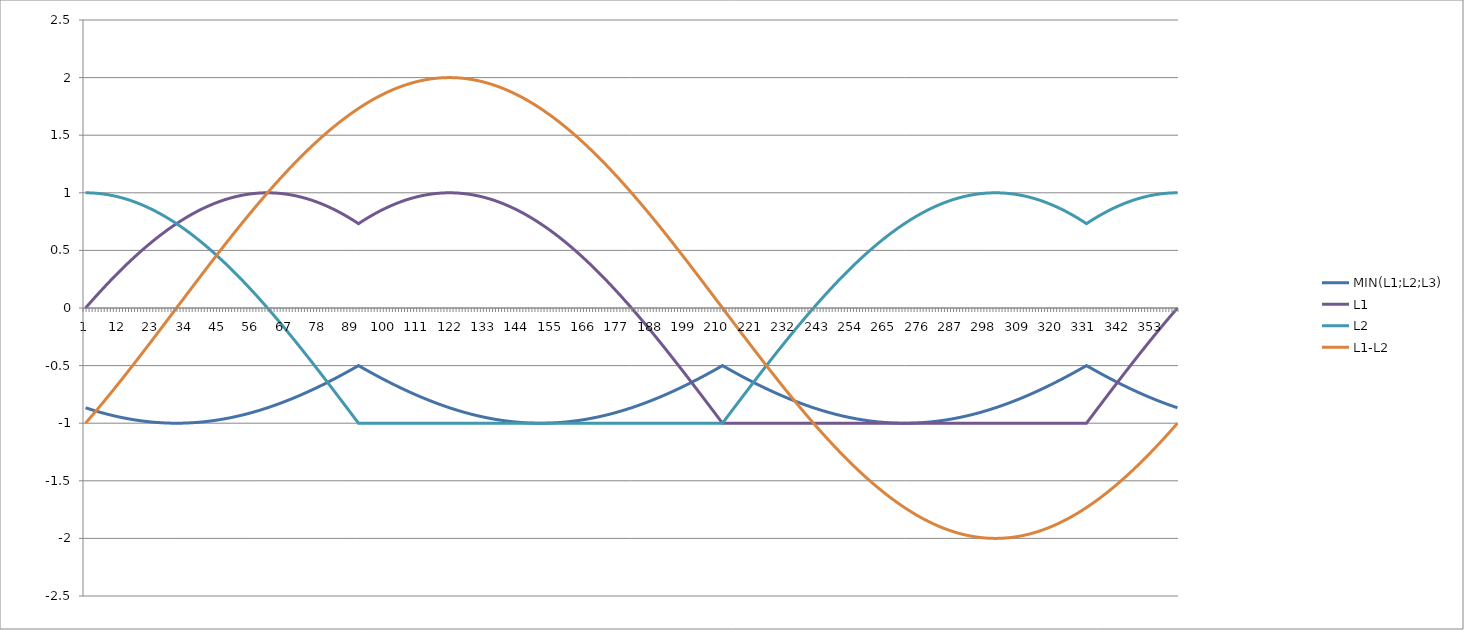
| Category | MIN(L1;L2;L3) | L1 | L2 | L1-L2 |
|---|---|---|---|---|
| 0 | -0.866 | 0 | 1 | -1 |
| 1 | -0.875 | 0.03 | 1 | -0.97 |
| 2 | -0.883 | 0.06 | 0.999 | -0.939 |
| 3 | -0.891 | 0.089 | 0.997 | -0.908 |
| 4 | -0.899 | 0.118 | 0.995 | -0.877 |
| 5 | -0.906 | 0.147 | 0.992 | -0.845 |
| 6 | -0.914 | 0.176 | 0.989 | -0.813 |
| 7 | -0.921 | 0.204 | 0.985 | -0.781 |
| 8 | -0.927 | 0.231 | 0.981 | -0.749 |
| 9 | -0.934 | 0.259 | 0.975 | -0.717 |
| 10 | -0.94 | 0.286 | 0.97 | -0.684 |
| 11 | -0.946 | 0.312 | 0.963 | -0.651 |
| 12 | -0.951 | 0.338 | 0.956 | -0.618 |
| 13 | -0.956 | 0.364 | 0.949 | -0.585 |
| 14 | -0.961 | 0.389 | 0.941 | -0.551 |
| 15 | -0.966 | 0.414 | 0.932 | -0.518 |
| 16 | -0.97 | 0.439 | 0.923 | -0.484 |
| 17 | -0.974 | 0.463 | 0.913 | -0.45 |
| 18 | -0.978 | 0.486 | 0.902 | -0.416 |
| 19 | -0.982 | 0.509 | 0.891 | -0.382 |
| 20 | -0.985 | 0.532 | 0.879 | -0.347 |
| 21 | -0.988 | 0.554 | 0.867 | -0.313 |
| 22 | -0.99 | 0.576 | 0.854 | -0.278 |
| 23 | -0.993 | 0.597 | 0.841 | -0.244 |
| 24 | -0.995 | 0.618 | 0.827 | -0.209 |
| 25 | -0.996 | 0.638 | 0.813 | -0.174 |
| 26 | -0.998 | 0.658 | 0.798 | -0.14 |
| 27 | -0.999 | 0.677 | 0.782 | -0.105 |
| 28 | -0.999 | 0.696 | 0.766 | -0.07 |
| 29 | -1 | 0.714 | 0.749 | -0.035 |
| 30 | -1 | 0.732 | 0.732 | 0 |
| 31 | -1 | 0.749 | 0.714 | 0.035 |
| 32 | -0.999 | 0.766 | 0.696 | 0.07 |
| 33 | -0.999 | 0.782 | 0.677 | 0.105 |
| 34 | -0.998 | 0.798 | 0.658 | 0.14 |
| 35 | -0.996 | 0.813 | 0.638 | 0.174 |
| 36 | -0.995 | 0.827 | 0.618 | 0.209 |
| 37 | -0.993 | 0.841 | 0.597 | 0.244 |
| 38 | -0.99 | 0.854 | 0.576 | 0.278 |
| 39 | -0.988 | 0.867 | 0.554 | 0.313 |
| 40 | -0.985 | 0.879 | 0.532 | 0.347 |
| 41 | -0.982 | 0.891 | 0.509 | 0.382 |
| 42 | -0.978 | 0.902 | 0.486 | 0.416 |
| 43 | -0.974 | 0.913 | 0.463 | 0.45 |
| 44 | -0.97 | 0.923 | 0.439 | 0.484 |
| 45 | -0.966 | 0.932 | 0.414 | 0.518 |
| 46 | -0.961 | 0.941 | 0.389 | 0.551 |
| 47 | -0.956 | 0.949 | 0.364 | 0.585 |
| 48 | -0.951 | 0.956 | 0.338 | 0.618 |
| 49 | -0.946 | 0.963 | 0.312 | 0.651 |
| 50 | -0.94 | 0.97 | 0.286 | 0.684 |
| 51 | -0.934 | 0.975 | 0.259 | 0.717 |
| 52 | -0.927 | 0.981 | 0.231 | 0.749 |
| 53 | -0.921 | 0.985 | 0.204 | 0.781 |
| 54 | -0.914 | 0.989 | 0.176 | 0.813 |
| 55 | -0.906 | 0.992 | 0.147 | 0.845 |
| 56 | -0.899 | 0.995 | 0.118 | 0.877 |
| 57 | -0.891 | 0.997 | 0.089 | 0.908 |
| 58 | -0.883 | 0.999 | 0.06 | 0.939 |
| 59 | -0.875 | 1 | 0.03 | 0.97 |
| 60 | -0.866 | 1 | 0 | 1 |
| 61 | -0.857 | 1 | -0.03 | 1.03 |
| 62 | -0.848 | 0.999 | -0.061 | 1.06 |
| 63 | -0.839 | 0.997 | -0.092 | 1.089 |
| 64 | -0.829 | 0.995 | -0.123 | 1.118 |
| 65 | -0.819 | 0.992 | -0.155 | 1.147 |
| 66 | -0.809 | 0.989 | -0.187 | 1.176 |
| 67 | -0.799 | 0.985 | -0.219 | 1.204 |
| 68 | -0.788 | 0.981 | -0.251 | 1.231 |
| 69 | -0.777 | 0.975 | -0.283 | 1.259 |
| 70 | -0.766 | 0.97 | -0.316 | 1.286 |
| 71 | -0.755 | 0.963 | -0.349 | 1.312 |
| 72 | -0.743 | 0.956 | -0.382 | 1.338 |
| 73 | -0.731 | 0.949 | -0.415 | 1.364 |
| 74 | -0.719 | 0.941 | -0.449 | 1.389 |
| 75 | -0.707 | 0.932 | -0.482 | 1.414 |
| 76 | -0.695 | 0.923 | -0.516 | 1.439 |
| 77 | -0.682 | 0.913 | -0.55 | 1.463 |
| 78 | -0.669 | 0.902 | -0.584 | 1.486 |
| 79 | -0.656 | 0.891 | -0.618 | 1.509 |
| 80 | -0.643 | 0.879 | -0.653 | 1.532 |
| 81 | -0.629 | 0.867 | -0.687 | 1.554 |
| 82 | -0.616 | 0.854 | -0.722 | 1.576 |
| 83 | -0.602 | 0.841 | -0.756 | 1.597 |
| 84 | -0.588 | 0.827 | -0.791 | 1.618 |
| 85 | -0.574 | 0.813 | -0.826 | 1.638 |
| 86 | -0.559 | 0.798 | -0.86 | 1.658 |
| 87 | -0.545 | 0.782 | -0.895 | 1.677 |
| 88 | -0.53 | 0.766 | -0.93 | 1.696 |
| 89 | -0.515 | 0.749 | -0.965 | 1.714 |
| 90 | -0.5 | 0.732 | -1 | 1.732 |
| 91 | -0.515 | 0.749 | -1 | 1.749 |
| 92 | -0.53 | 0.766 | -1 | 1.766 |
| 93 | -0.545 | 0.782 | -1 | 1.782 |
| 94 | -0.559 | 0.798 | -1 | 1.798 |
| 95 | -0.574 | 0.813 | -1 | 1.813 |
| 96 | -0.588 | 0.827 | -1 | 1.827 |
| 97 | -0.602 | 0.841 | -1 | 1.841 |
| 98 | -0.616 | 0.854 | -1 | 1.854 |
| 99 | -0.629 | 0.867 | -1 | 1.867 |
| 100 | -0.643 | 0.879 | -1 | 1.879 |
| 101 | -0.656 | 0.891 | -1 | 1.891 |
| 102 | -0.669 | 0.902 | -1 | 1.902 |
| 103 | -0.682 | 0.913 | -1 | 1.913 |
| 104 | -0.695 | 0.923 | -1 | 1.923 |
| 105 | -0.707 | 0.932 | -1 | 1.932 |
| 106 | -0.719 | 0.941 | -1 | 1.941 |
| 107 | -0.731 | 0.949 | -1 | 1.949 |
| 108 | -0.743 | 0.956 | -1 | 1.956 |
| 109 | -0.755 | 0.963 | -1 | 1.963 |
| 110 | -0.766 | 0.97 | -1 | 1.97 |
| 111 | -0.777 | 0.975 | -1 | 1.975 |
| 112 | -0.788 | 0.981 | -1 | 1.981 |
| 113 | -0.799 | 0.985 | -1 | 1.985 |
| 114 | -0.809 | 0.989 | -1 | 1.989 |
| 115 | -0.819 | 0.992 | -1 | 1.992 |
| 116 | -0.829 | 0.995 | -1 | 1.995 |
| 117 | -0.839 | 0.997 | -1 | 1.997 |
| 118 | -0.848 | 0.999 | -1 | 1.999 |
| 119 | -0.857 | 1 | -1 | 2 |
| 120 | -0.866 | 1 | -1 | 2 |
| 121 | -0.875 | 1 | -1 | 2 |
| 122 | -0.883 | 0.999 | -1 | 1.999 |
| 123 | -0.891 | 0.997 | -1 | 1.997 |
| 124 | -0.899 | 0.995 | -1 | 1.995 |
| 125 | -0.906 | 0.992 | -1 | 1.992 |
| 126 | -0.914 | 0.989 | -1 | 1.989 |
| 127 | -0.921 | 0.985 | -1 | 1.985 |
| 128 | -0.927 | 0.981 | -1 | 1.981 |
| 129 | -0.934 | 0.975 | -1 | 1.975 |
| 130 | -0.94 | 0.97 | -1 | 1.97 |
| 131 | -0.946 | 0.963 | -1 | 1.963 |
| 132 | -0.951 | 0.956 | -1 | 1.956 |
| 133 | -0.956 | 0.949 | -1 | 1.949 |
| 134 | -0.961 | 0.941 | -1 | 1.941 |
| 135 | -0.966 | 0.932 | -1 | 1.932 |
| 136 | -0.97 | 0.923 | -1 | 1.923 |
| 137 | -0.974 | 0.913 | -1 | 1.913 |
| 138 | -0.978 | 0.902 | -1 | 1.902 |
| 139 | -0.982 | 0.891 | -1 | 1.891 |
| 140 | -0.985 | 0.879 | -1 | 1.879 |
| 141 | -0.988 | 0.867 | -1 | 1.867 |
| 142 | -0.99 | 0.854 | -1 | 1.854 |
| 143 | -0.993 | 0.841 | -1 | 1.841 |
| 144 | -0.995 | 0.827 | -1 | 1.827 |
| 145 | -0.996 | 0.813 | -1 | 1.813 |
| 146 | -0.998 | 0.798 | -1 | 1.798 |
| 147 | -0.999 | 0.782 | -1 | 1.782 |
| 148 | -0.999 | 0.766 | -1 | 1.766 |
| 149 | -1 | 0.749 | -1 | 1.749 |
| 150 | -1 | 0.732 | -1 | 1.732 |
| 151 | -1 | 0.714 | -1 | 1.714 |
| 152 | -0.999 | 0.696 | -1 | 1.696 |
| 153 | -0.999 | 0.677 | -1 | 1.677 |
| 154 | -0.998 | 0.658 | -1 | 1.658 |
| 155 | -0.996 | 0.638 | -1 | 1.638 |
| 156 | -0.995 | 0.618 | -1 | 1.618 |
| 157 | -0.993 | 0.597 | -1 | 1.597 |
| 158 | -0.99 | 0.576 | -1 | 1.576 |
| 159 | -0.988 | 0.554 | -1 | 1.554 |
| 160 | -0.985 | 0.532 | -1 | 1.532 |
| 161 | -0.982 | 0.509 | -1 | 1.509 |
| 162 | -0.978 | 0.486 | -1 | 1.486 |
| 163 | -0.974 | 0.463 | -1 | 1.463 |
| 164 | -0.97 | 0.439 | -1 | 1.439 |
| 165 | -0.966 | 0.414 | -1 | 1.414 |
| 166 | -0.961 | 0.389 | -1 | 1.389 |
| 167 | -0.956 | 0.364 | -1 | 1.364 |
| 168 | -0.951 | 0.338 | -1 | 1.338 |
| 169 | -0.946 | 0.312 | -1 | 1.312 |
| 170 | -0.94 | 0.286 | -1 | 1.286 |
| 171 | -0.934 | 0.259 | -1 | 1.259 |
| 172 | -0.927 | 0.231 | -1 | 1.231 |
| 173 | -0.921 | 0.204 | -1 | 1.204 |
| 174 | -0.914 | 0.176 | -1 | 1.176 |
| 175 | -0.906 | 0.147 | -1 | 1.147 |
| 176 | -0.899 | 0.118 | -1 | 1.118 |
| 177 | -0.891 | 0.089 | -1 | 1.089 |
| 178 | -0.883 | 0.06 | -1 | 1.06 |
| 179 | -0.875 | 0.03 | -1 | 1.03 |
| 180 | -0.866 | 0 | -1 | 1 |
| 181 | -0.857 | -0.03 | -1 | 0.97 |
| 182 | -0.848 | -0.061 | -1 | 0.939 |
| 183 | -0.839 | -0.092 | -1 | 0.908 |
| 184 | -0.829 | -0.123 | -1 | 0.877 |
| 185 | -0.819 | -0.155 | -1 | 0.845 |
| 186 | -0.809 | -0.187 | -1 | 0.813 |
| 187 | -0.799 | -0.219 | -1 | 0.781 |
| 188 | -0.788 | -0.251 | -1 | 0.749 |
| 189 | -0.777 | -0.283 | -1 | 0.717 |
| 190 | -0.766 | -0.316 | -1 | 0.684 |
| 191 | -0.755 | -0.349 | -1 | 0.651 |
| 192 | -0.743 | -0.382 | -1 | 0.618 |
| 193 | -0.731 | -0.415 | -1 | 0.585 |
| 194 | -0.719 | -0.449 | -1 | 0.551 |
| 195 | -0.707 | -0.482 | -1 | 0.518 |
| 196 | -0.695 | -0.516 | -1 | 0.484 |
| 197 | -0.682 | -0.55 | -1 | 0.45 |
| 198 | -0.669 | -0.584 | -1 | 0.416 |
| 199 | -0.656 | -0.618 | -1 | 0.382 |
| 200 | -0.643 | -0.653 | -1 | 0.347 |
| 201 | -0.629 | -0.687 | -1 | 0.313 |
| 202 | -0.616 | -0.722 | -1 | 0.278 |
| 203 | -0.602 | -0.756 | -1 | 0.244 |
| 204 | -0.588 | -0.791 | -1 | 0.209 |
| 205 | -0.574 | -0.826 | -1 | 0.174 |
| 206 | -0.559 | -0.86 | -1 | 0.14 |
| 207 | -0.545 | -0.895 | -1 | 0.105 |
| 208 | -0.53 | -0.93 | -1 | 0.07 |
| 209 | -0.515 | -0.965 | -1 | 0.035 |
| 210 | -0.5 | -1 | -1 | 0 |
| 211 | -0.515 | -1 | -0.965 | -0.035 |
| 212 | -0.53 | -1 | -0.93 | -0.07 |
| 213 | -0.545 | -1 | -0.895 | -0.105 |
| 214 | -0.559 | -1 | -0.86 | -0.14 |
| 215 | -0.574 | -1 | -0.826 | -0.174 |
| 216 | -0.588 | -1 | -0.791 | -0.209 |
| 217 | -0.602 | -1 | -0.756 | -0.244 |
| 218 | -0.616 | -1 | -0.722 | -0.278 |
| 219 | -0.629 | -1 | -0.687 | -0.313 |
| 220 | -0.643 | -1 | -0.653 | -0.347 |
| 221 | -0.656 | -1 | -0.618 | -0.382 |
| 222 | -0.669 | -1 | -0.584 | -0.416 |
| 223 | -0.682 | -1 | -0.55 | -0.45 |
| 224 | -0.695 | -1 | -0.516 | -0.484 |
| 225 | -0.707 | -1 | -0.482 | -0.518 |
| 226 | -0.719 | -1 | -0.449 | -0.551 |
| 227 | -0.731 | -1 | -0.415 | -0.585 |
| 228 | -0.743 | -1 | -0.382 | -0.618 |
| 229 | -0.755 | -1 | -0.349 | -0.651 |
| 230 | -0.766 | -1 | -0.316 | -0.684 |
| 231 | -0.777 | -1 | -0.283 | -0.717 |
| 232 | -0.788 | -1 | -0.251 | -0.749 |
| 233 | -0.799 | -1 | -0.219 | -0.781 |
| 234 | -0.809 | -1 | -0.187 | -0.813 |
| 235 | -0.819 | -1 | -0.155 | -0.845 |
| 236 | -0.829 | -1 | -0.123 | -0.877 |
| 237 | -0.839 | -1 | -0.092 | -0.908 |
| 238 | -0.848 | -1 | -0.061 | -0.939 |
| 239 | -0.857 | -1 | -0.03 | -0.97 |
| 240 | -0.866 | -1 | 0 | -1 |
| 241 | -0.875 | -1 | 0.03 | -1.03 |
| 242 | -0.883 | -1 | 0.06 | -1.06 |
| 243 | -0.891 | -1 | 0.089 | -1.089 |
| 244 | -0.899 | -1 | 0.118 | -1.118 |
| 245 | -0.906 | -1 | 0.147 | -1.147 |
| 246 | -0.914 | -1 | 0.176 | -1.176 |
| 247 | -0.921 | -1 | 0.204 | -1.204 |
| 248 | -0.927 | -1 | 0.231 | -1.231 |
| 249 | -0.934 | -1 | 0.259 | -1.259 |
| 250 | -0.94 | -1 | 0.286 | -1.286 |
| 251 | -0.946 | -1 | 0.312 | -1.312 |
| 252 | -0.951 | -1 | 0.338 | -1.338 |
| 253 | -0.956 | -1 | 0.364 | -1.364 |
| 254 | -0.961 | -1 | 0.389 | -1.389 |
| 255 | -0.966 | -1 | 0.414 | -1.414 |
| 256 | -0.97 | -1 | 0.439 | -1.439 |
| 257 | -0.974 | -1 | 0.463 | -1.463 |
| 258 | -0.978 | -1 | 0.486 | -1.486 |
| 259 | -0.982 | -1 | 0.509 | -1.509 |
| 260 | -0.985 | -1 | 0.532 | -1.532 |
| 261 | -0.988 | -1 | 0.554 | -1.554 |
| 262 | -0.99 | -1 | 0.576 | -1.576 |
| 263 | -0.993 | -1 | 0.597 | -1.597 |
| 264 | -0.995 | -1 | 0.618 | -1.618 |
| 265 | -0.996 | -1 | 0.638 | -1.638 |
| 266 | -0.998 | -1 | 0.658 | -1.658 |
| 267 | -0.999 | -1 | 0.677 | -1.677 |
| 268 | -0.999 | -1 | 0.696 | -1.696 |
| 269 | -1 | -1 | 0.714 | -1.714 |
| 270 | -1 | -1 | 0.732 | -1.732 |
| 271 | -1 | -1 | 0.749 | -1.749 |
| 272 | -0.999 | -1 | 0.766 | -1.766 |
| 273 | -0.999 | -1 | 0.782 | -1.782 |
| 274 | -0.998 | -1 | 0.798 | -1.798 |
| 275 | -0.996 | -1 | 0.813 | -1.813 |
| 276 | -0.995 | -1 | 0.827 | -1.827 |
| 277 | -0.993 | -1 | 0.841 | -1.841 |
| 278 | -0.99 | -1 | 0.854 | -1.854 |
| 279 | -0.988 | -1 | 0.867 | -1.867 |
| 280 | -0.985 | -1 | 0.879 | -1.879 |
| 281 | -0.982 | -1 | 0.891 | -1.891 |
| 282 | -0.978 | -1 | 0.902 | -1.902 |
| 283 | -0.974 | -1 | 0.913 | -1.913 |
| 284 | -0.97 | -1 | 0.923 | -1.923 |
| 285 | -0.966 | -1 | 0.932 | -1.932 |
| 286 | -0.961 | -1 | 0.941 | -1.941 |
| 287 | -0.956 | -1 | 0.949 | -1.949 |
| 288 | -0.951 | -1 | 0.956 | -1.956 |
| 289 | -0.946 | -1 | 0.963 | -1.963 |
| 290 | -0.94 | -1 | 0.97 | -1.97 |
| 291 | -0.934 | -1 | 0.975 | -1.975 |
| 292 | -0.927 | -1 | 0.981 | -1.981 |
| 293 | -0.921 | -1 | 0.985 | -1.985 |
| 294 | -0.914 | -1 | 0.989 | -1.989 |
| 295 | -0.906 | -1 | 0.992 | -1.992 |
| 296 | -0.899 | -1 | 0.995 | -1.995 |
| 297 | -0.891 | -1 | 0.997 | -1.997 |
| 298 | -0.883 | -1 | 0.999 | -1.999 |
| 299 | -0.875 | -1 | 1 | -2 |
| 300 | -0.866 | -1 | 1 | -2 |
| 301 | -0.857 | -1 | 1 | -2 |
| 302 | -0.848 | -1 | 0.999 | -1.999 |
| 303 | -0.839 | -1 | 0.997 | -1.997 |
| 304 | -0.829 | -1 | 0.995 | -1.995 |
| 305 | -0.819 | -1 | 0.992 | -1.992 |
| 306 | -0.809 | -1 | 0.989 | -1.989 |
| 307 | -0.799 | -1 | 0.985 | -1.985 |
| 308 | -0.788 | -1 | 0.981 | -1.981 |
| 309 | -0.777 | -1 | 0.975 | -1.975 |
| 310 | -0.766 | -1 | 0.97 | -1.97 |
| 311 | -0.755 | -1 | 0.963 | -1.963 |
| 312 | -0.743 | -1 | 0.956 | -1.956 |
| 313 | -0.731 | -1 | 0.949 | -1.949 |
| 314 | -0.719 | -1 | 0.941 | -1.941 |
| 315 | -0.707 | -1 | 0.932 | -1.932 |
| 316 | -0.695 | -1 | 0.923 | -1.923 |
| 317 | -0.682 | -1 | 0.913 | -1.913 |
| 318 | -0.669 | -1 | 0.902 | -1.902 |
| 319 | -0.656 | -1 | 0.891 | -1.891 |
| 320 | -0.643 | -1 | 0.879 | -1.879 |
| 321 | -0.629 | -1 | 0.867 | -1.867 |
| 322 | -0.616 | -1 | 0.854 | -1.854 |
| 323 | -0.602 | -1 | 0.841 | -1.841 |
| 324 | -0.588 | -1 | 0.827 | -1.827 |
| 325 | -0.574 | -1 | 0.813 | -1.813 |
| 326 | -0.559 | -1 | 0.798 | -1.798 |
| 327 | -0.545 | -1 | 0.782 | -1.782 |
| 328 | -0.53 | -1 | 0.766 | -1.766 |
| 329 | -0.515 | -1 | 0.749 | -1.749 |
| 330 | -0.5 | -1 | 0.732 | -1.732 |
| 331 | -0.515 | -0.965 | 0.749 | -1.714 |
| 332 | -0.53 | -0.93 | 0.766 | -1.696 |
| 333 | -0.545 | -0.895 | 0.782 | -1.677 |
| 334 | -0.559 | -0.86 | 0.798 | -1.658 |
| 335 | -0.574 | -0.826 | 0.813 | -1.638 |
| 336 | -0.588 | -0.791 | 0.827 | -1.618 |
| 337 | -0.602 | -0.756 | 0.841 | -1.597 |
| 338 | -0.616 | -0.722 | 0.854 | -1.576 |
| 339 | -0.629 | -0.687 | 0.867 | -1.554 |
| 340 | -0.643 | -0.653 | 0.879 | -1.532 |
| 341 | -0.656 | -0.618 | 0.891 | -1.509 |
| 342 | -0.669 | -0.584 | 0.902 | -1.486 |
| 343 | -0.682 | -0.55 | 0.913 | -1.463 |
| 344 | -0.695 | -0.516 | 0.923 | -1.439 |
| 345 | -0.707 | -0.482 | 0.932 | -1.414 |
| 346 | -0.719 | -0.449 | 0.941 | -1.389 |
| 347 | -0.731 | -0.415 | 0.949 | -1.364 |
| 348 | -0.743 | -0.382 | 0.956 | -1.338 |
| 349 | -0.755 | -0.349 | 0.963 | -1.312 |
| 350 | -0.766 | -0.316 | 0.97 | -1.286 |
| 351 | -0.777 | -0.283 | 0.975 | -1.259 |
| 352 | -0.788 | -0.251 | 0.981 | -1.231 |
| 353 | -0.799 | -0.219 | 0.985 | -1.204 |
| 354 | -0.809 | -0.187 | 0.989 | -1.176 |
| 355 | -0.819 | -0.155 | 0.992 | -1.147 |
| 356 | -0.829 | -0.123 | 0.995 | -1.118 |
| 357 | -0.839 | -0.092 | 0.997 | -1.089 |
| 358 | -0.848 | -0.061 | 0.999 | -1.06 |
| 359 | -0.857 | -0.03 | 1 | -1.03 |
| 360 | -0.866 | 0 | 1 | -1 |